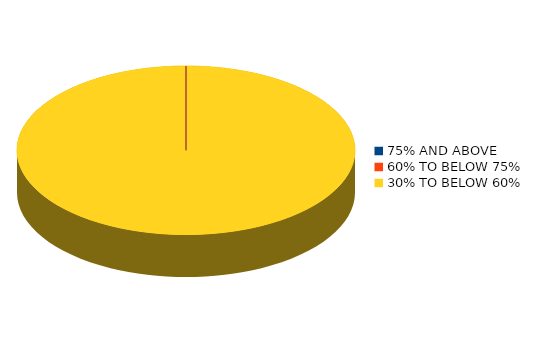
| Category | Number of students |
|---|---|
| 75% AND ABOVE | 0 |
| 60% TO BELOW 75% | 0 |
| 30% TO BELOW 60% | 3 |